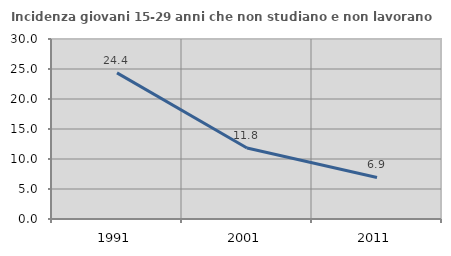
| Category | Incidenza giovani 15-29 anni che non studiano e non lavorano  |
|---|---|
| 1991.0 | 24.359 |
| 2001.0 | 11.837 |
| 2011.0 | 6.926 |